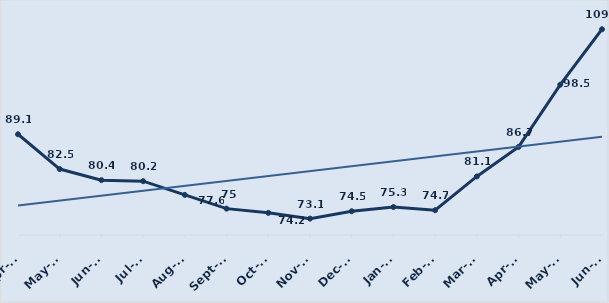
| Category | Series 0 |
|---|---|
| 42826.0 | 89.1 |
| 42856.0 | 82.5 |
| 42887.0 | 80.4 |
| 42917.0 | 80.2 |
| 42948.0 | 77.6 |
| 42979.0 | 75 |
| 43009.0 | 74.2 |
| 43040.0 | 73.1 |
| 43070.0 | 74.5 |
| 43101.0 | 75.3 |
| 43132.0 | 74.7 |
| 43160.0 | 81.1 |
| 43191.0 | 86.7 |
| 43221.0 | 98.5 |
| 43252.0 | 109 |